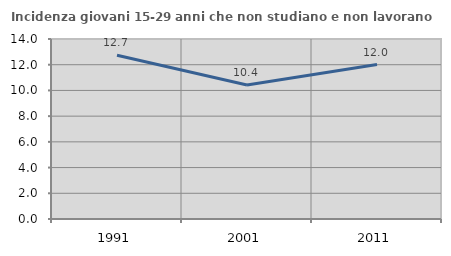
| Category | Incidenza giovani 15-29 anni che non studiano e non lavorano  |
|---|---|
| 1991.0 | 12.731 |
| 2001.0 | 10.428 |
| 2011.0 | 12.01 |